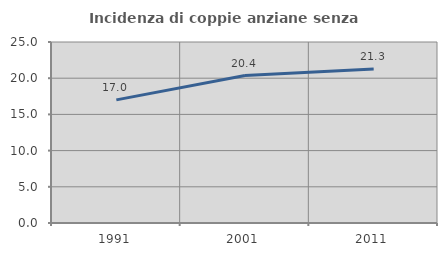
| Category | Incidenza di coppie anziane senza figli  |
|---|---|
| 1991.0 | 17.007 |
| 2001.0 | 20.364 |
| 2011.0 | 21.269 |